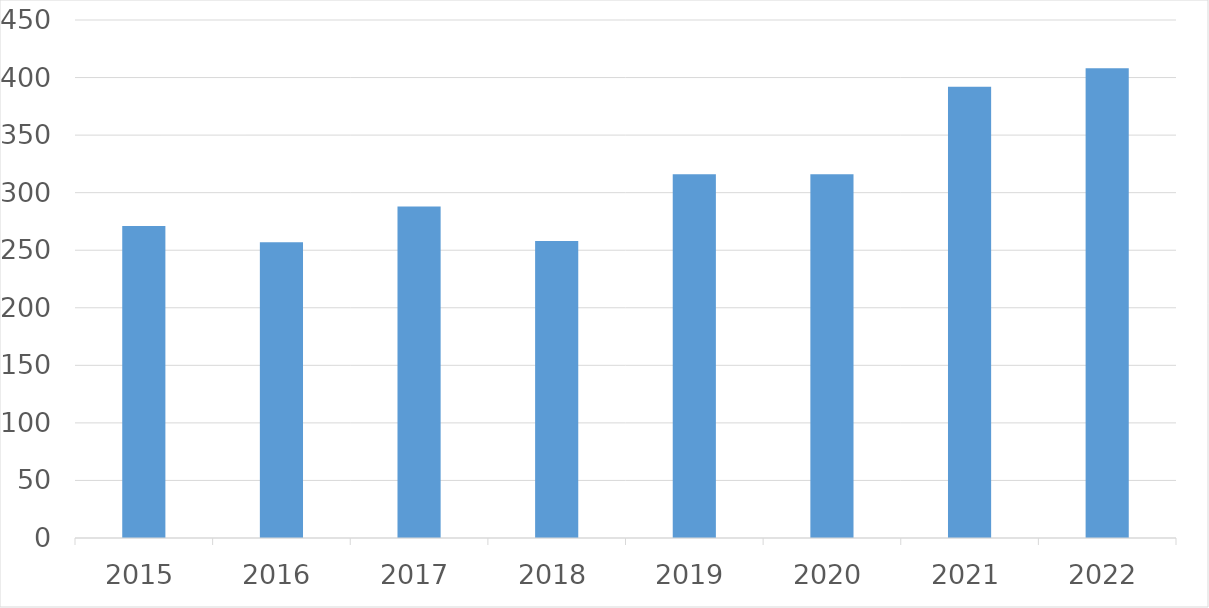
| Category | Series 0 |
|---|---|
| 2015 | 271 |
| 2016 | 257 |
| 2017 | 288 |
| 2018 | 258 |
| 2019 | 316 |
| 2020 | 316 |
| 2021 | 392 |
| 2022 | 408 |